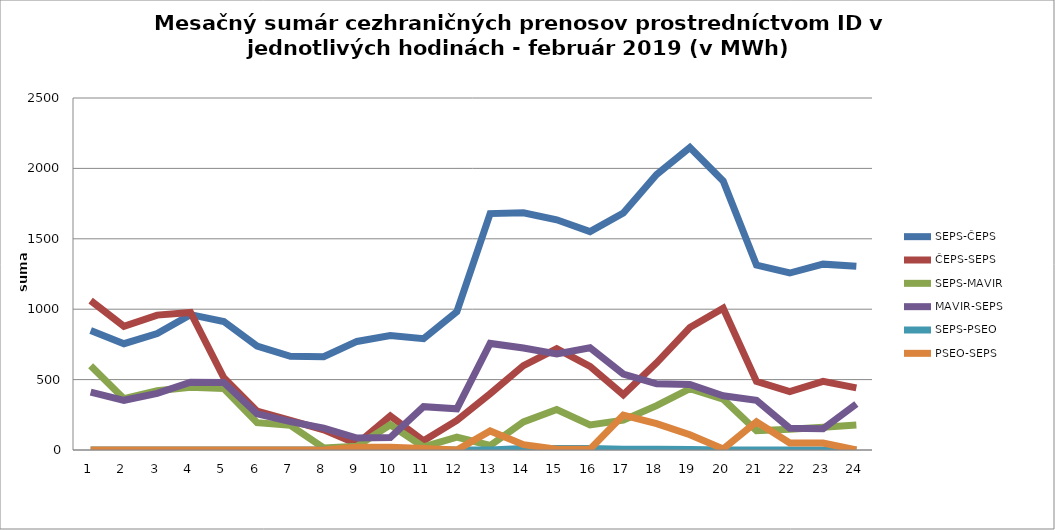
| Category | SEPS-ČEPS | ČEPS-SEPS | SEPS-MAVIR | MAVIR-SEPS | SEPS-PSEO | PSEO-SEPS |
|---|---|---|---|---|---|---|
| 1.0 | 848 | 1061 | 599 | 411 | 0 | 0 |
| 2.0 | 755 | 878 | 364 | 353 | 0 | 0 |
| 3.0 | 827 | 958 | 421 | 402 | 0 | 0 |
| 4.0 | 961 | 977 | 446 | 481 | 0 | 0 |
| 5.0 | 913 | 513 | 436 | 479 | 0 | 0 |
| 6.0 | 738 | 276 | 194 | 257 | 0 | 0 |
| 7.0 | 665 | 210 | 175 | 202 | 0 | 0 |
| 8.0 | 662 | 143 | 15 | 155 | 0 | 0 |
| 9.0 | 771 | 43 | 27 | 85 | 0 | 20 |
| 10.0 | 813 | 241 | 179 | 88 | 0 | 20 |
| 11.0 | 791 | 65 | 22 | 308 | 0 | 10 |
| 12.0 | 982 | 210 | 91 | 293 | 0 | 0 |
| 13.0 | 1679 | 400 | 32 | 757 | 0 | 135 |
| 14.0 | 1685 | 599 | 199 | 724 | 10 | 38 |
| 15.0 | 1635 | 720 | 287 | 683 | 10 | 6 |
| 16.0 | 1551 | 594 | 178 | 726 | 10 | 6 |
| 17.0 | 1683 | 393 | 212 | 539 | 5 | 248 |
| 18.0 | 1957 | 619 | 315 | 470 | 5 | 187 |
| 19.0 | 2149 | 870 | 435 | 465 | 3 | 108 |
| 20.0 | 1910 | 1007 | 361 | 385 | 0 | 8 |
| 21.0 | 1313 | 487 | 137 | 353 | 0 | 200 |
| 22.0 | 1257 | 415 | 148 | 155 | 0 | 50 |
| 23.0 | 1320 | 487 | 162 | 151 | 0 | 50 |
| 24.0 | 1305 | 441 | 178 | 327 | 0 | 0 |